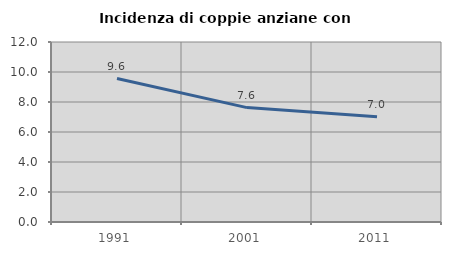
| Category | Incidenza di coppie anziane con figli |
|---|---|
| 1991.0 | 9.565 |
| 2001.0 | 7.627 |
| 2011.0 | 7.018 |